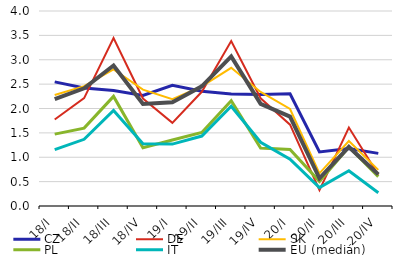
| Category | CZ | DE | SK | PL | IT | EU (medián) |
|---|---|---|---|---|---|---|
| 18/I | 2.546 | 1.774 | 2.276 | 1.474 | 1.155 | 2.191 |
| 18/II | 2.422 | 2.212 | 2.459 | 1.597 | 1.368 | 2.413 |
| 18/III | 2.368 | 3.445 | 2.804 | 2.249 | 1.959 | 2.883 |
| 18/IV | 2.27 | 2.204 | 2.387 | 1.195 | 1.276 | 2.092 |
| 19/I | 2.475 | 1.706 | 2.19 | 1.353 | 1.27 | 2.128 |
| 19/II | 2.352 | 2.343 | 2.454 | 1.508 | 1.435 | 2.456 |
| 19/III | 2.296 | 3.383 | 2.835 | 2.159 | 2.045 | 3.068 |
| 19/IV | 2.286 | 2.21 | 2.339 | 1.189 | 1.308 | 2.094 |
| 20/I | 2.302 | 1.669 | 1.99 | 1.16 | 0.962 | 1.835 |
| 20/II | 1.109 | 0.325 | 0.671 | 0.505 | 0.379 | 0.569 |
| 20/III | 1.179 | 1.61 | 1.332 | 1.211 | 0.722 | 1.212 |
| 20/IV | 1.08 | 0.64 | 0.741 | 0.604 | 0.271 | 0.649 |